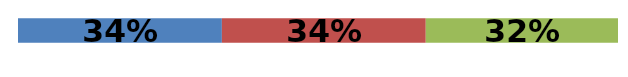
| Category | Series 0 | Series 1 | Series 2 |
|---|---|---|---|
| 0 | 0.34 | 0.34 | 0.32 |